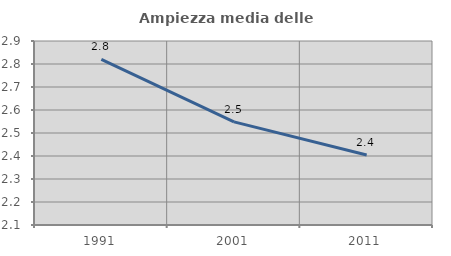
| Category | Ampiezza media delle famiglie |
|---|---|
| 1991.0 | 2.82 |
| 2001.0 | 2.548 |
| 2011.0 | 2.404 |